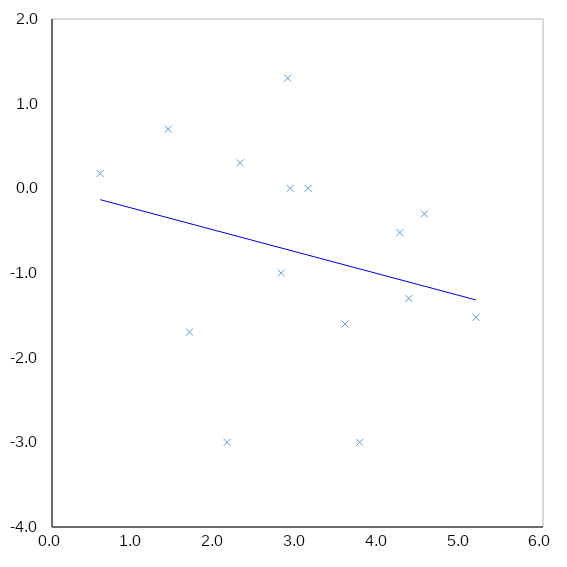
| Category | log10(efficacy) |
|---|---|
| 5.18 | -1.523 |
| 2.8 | -1 |
| 4.55 | -0.301 |
| 2.3 | 0.301 |
| 3.76 | -3 |
| 4.36 | -1.301 |
| 4.25 | -0.523 |
| 2.91 | 0 |
| 2.88 | 1.301 |
| 3.58 | -1.602 |
| 1.42 | 0.699 |
| 1.68 | -1.699 |
| 2.14 | -3 |
| 0.59 | 0.176 |
| 3.13 | 0 |